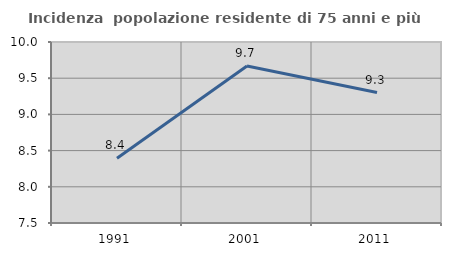
| Category | Incidenza  popolazione residente di 75 anni e più |
|---|---|
| 1991.0 | 8.395 |
| 2001.0 | 9.67 |
| 2011.0 | 9.302 |